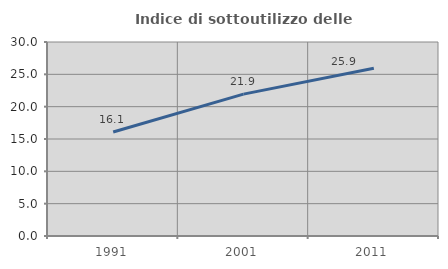
| Category | Indice di sottoutilizzo delle abitazioni  |
|---|---|
| 1991.0 | 16.079 |
| 2001.0 | 21.935 |
| 2011.0 | 25.949 |